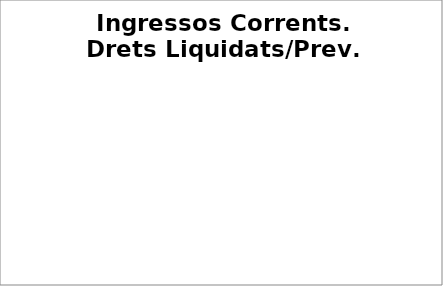
| Category | Series 0 |
|---|---|
| Impostos locals | 0.296 |
| Participació Tributs de l'Estat | 0.244 |
| Taxes i altres ingressos | 0.176 |
| Transferències corrents (exc. FCF) | 0.309 |
| Ingressos patrimonials | 0.089 |
| Ingressos corrents | 0.257 |